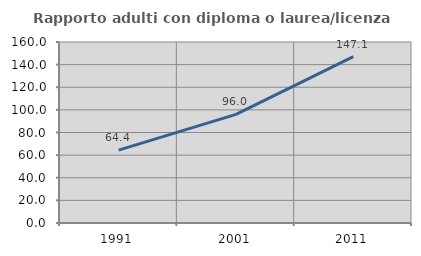
| Category | Rapporto adulti con diploma o laurea/licenza media  |
|---|---|
| 1991.0 | 64.418 |
| 2001.0 | 95.992 |
| 2011.0 | 147.144 |